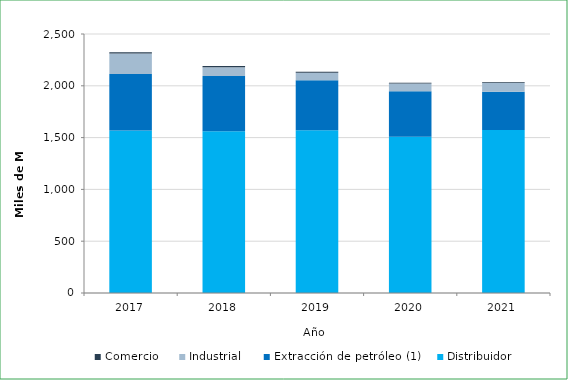
| Category | Distribuidor | Extracción de petróleo (1) | Industrial | Comercio |
|---|---|---|---|---|
| 2017.0 | 1569017.221 | 544571.642 | 198215.644 | 11049.878 |
| 2018.0 | 1560390.6 | 533223.314 | 86463.67 | 9981.586 |
| 2019.0 | 1572125 | 480419.95 | 74407.873 | 9083.459 |
| 2020.0 | 1508982.305 | 439260.752 | 73949.193 | 6444.877 |
| 2021.0 | 1572190.302 | 369613.079 | 85698.354 | 7080.262 |